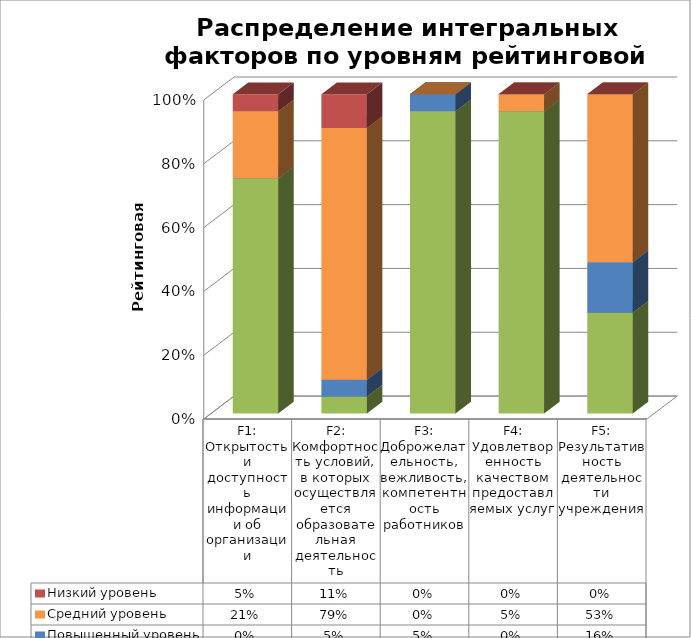
| Category | Высокий уровень | Повышенный уровень | Средний уровень | Низкий уровень |
|---|---|---|---|---|
| F1: Открытость и доступность информации об организации | 0.737 | 0 | 0.211 | 0.053 |
| F2: Комфортность условий, в которых осуществляется образовательная деятельность | 0.053 | 0.053 | 0.789 | 0.105 |
| F3: Доброжелательность, вежливость, компетентность работников | 0.947 | 0.053 | 0 | 0 |
| F4: Удовлетворенность качеством предоставляемых услуг | 0.947 | 0 | 0.053 | 0 |
| F5: Результативность деятельности учреждения | 0.316 | 0.158 | 0.526 | 0 |